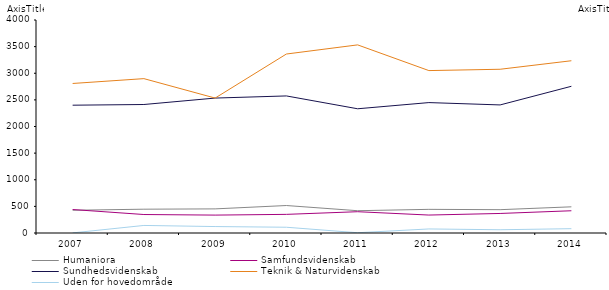
| Category | Humaniora | Samfundsvidenskab | Sundhedsvidenskab | Teknik & Naturvidenskab | Uden for hovedområde |
|---|---|---|---|---|---|
| 2007.0 | 427 | 441 | 2400 | 2808 | 2 |
| 2008.0 | 447 | 347 | 2413 | 2898.945 | 142 |
| 2009.0 | 453 | 336 | 2534 | 2534 | 121 |
| 2010.0 | 516 | 350 | 2574 | 3361 | 108 |
| 2011.0 | 418.526 | 399.709 | 2333 | 3532.765 | 5 |
| 2012.0 | 444 | 337 | 2449 | 3050 | 76 |
| 2013.0 | 438 | 367 | 2405 | 3075 | 61 |
| 2014.0 | 491.701 | 417.649 | 2755 | 3235 | 81 |